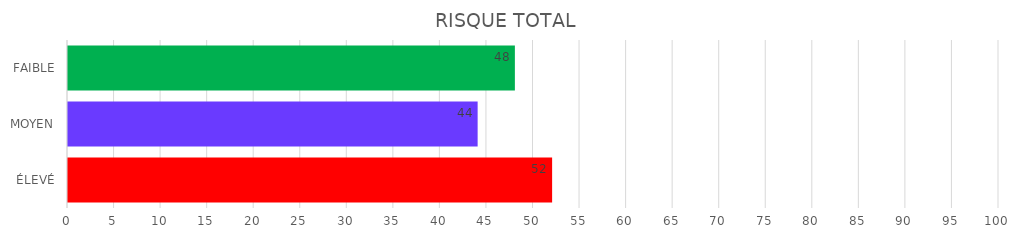
| Category | Series 1 | Series 0 |
|---|---|---|
| ÉLEVÉ | 52 | 52 |
| MOYEN | 44 | 44 |
| FAIBLE | 48 | 48 |